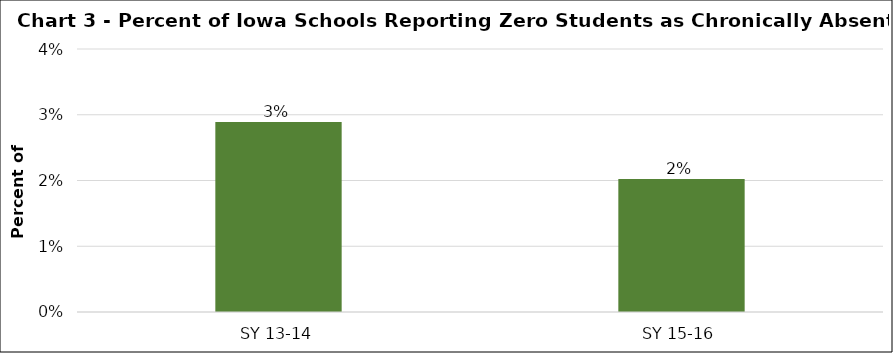
| Category | Series 0 |
|---|---|
| SY 13-14 | 0.029 |
| SY 15-16 | 0.02 |